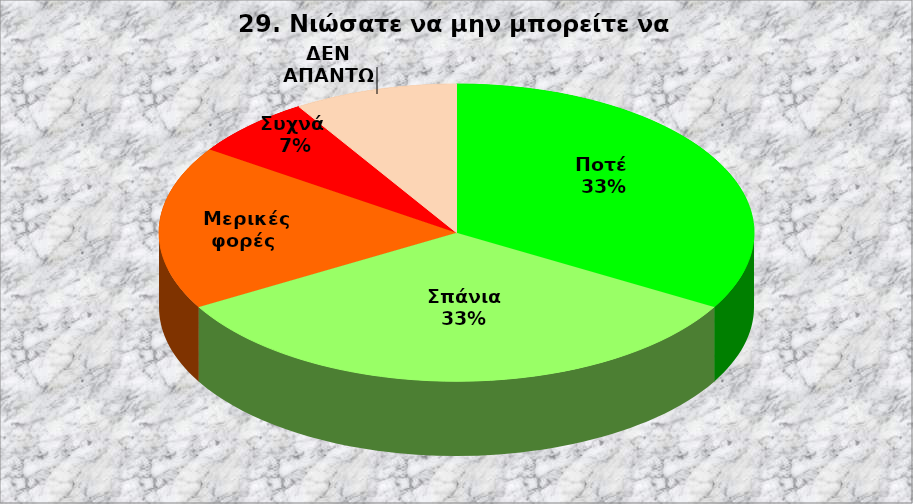
| Category | Series 0 |
|---|---|
| Ποτέ  | 15 |
| Σπάνια  | 15 |
| Μερικές φορές  | 8 |
| Συχνά  | 3 |
| Συνήθως  | 0 |
| ΔΕΝ ΑΠΑΝΤΩ | 4 |